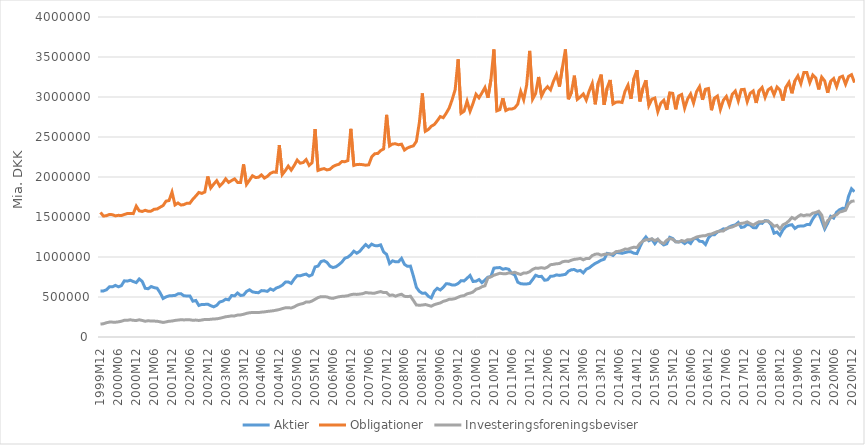
| Category | Aktier | Obligationer | Investeringsforeningsbeviser |
|---|---|---|---|
| 1999M12 | 575174 | 1557344 | 160748 |
| 2000M01 | 575647 | 1511391 | 165778 |
| 2000M02 | 590162 | 1516681 | 178351 |
| 2000M03 | 627205 | 1531792 | 186450 |
| 2000M04 | 627098 | 1528959 | 185941 |
| 2000M05 | 645738 | 1514125 | 184746 |
| 2000M06 | 627336 | 1521104 | 189451 |
| 2000M07 | 641242 | 1517881 | 196711 |
| 2000M08 | 702030 | 1531576 | 209725 |
| 2000M09 | 698497 | 1543590 | 208058 |
| 2000M10 | 709608 | 1545110 | 215514 |
| 2000M11 | 693340 | 1542126 | 208436 |
| 2000M12 | 679721 | 1635693 | 206347 |
| 2001M01 | 725587 | 1576917 | 214998 |
| 2001M02 | 694857 | 1569066 | 206745 |
| 2001M03 | 609401 | 1583968 | 196955 |
| 2001M04 | 603191 | 1572117 | 203492 |
| 2001M05 | 630929 | 1573534 | 198988 |
| 2001M06 | 617507 | 1596730 | 199211 |
| 2001M07 | 609553 | 1600137 | 196654 |
| 2001M08 | 553257 | 1622133 | 190230 |
| 2001M09 | 481246 | 1642834 | 181861 |
| 2001M10 | 501680 | 1698473 | 188909 |
| 2001M11 | 513948 | 1705760 | 196822 |
| 2001M12 | 516411 | 1811508 | 199644 |
| 2002M01 | 519822 | 1650899 | 207163 |
| 2002M02 | 539138 | 1675130 | 211558 |
| 2002M03 | 541132 | 1649367 | 216023 |
| 2002M04 | 514315 | 1654759 | 213580 |
| 2002M05 | 513817 | 1672767 | 215308 |
| 2002M06 | 513817 | 1672767 | 215308 |
| 2002M07 | 447539 | 1723382 | 208760 |
| 2002M08 | 456303 | 1762651 | 211579 |
| 2002M09 | 394395 | 1806730 | 206568 |
| 2002M10 | 406663 | 1795063 | 212548 |
| 2002M11 | 407258 | 1812469 | 219093 |
| 2002M12 | 410511 | 2006227 | 217309 |
| 2003M01 | 391549 | 1863047 | 221673 |
| 2003M02 | 376802 | 1911051 | 225702 |
| 2003M03 | 395690 | 1954134 | 227024 |
| 2003M04 | 437489 | 1886932 | 234152 |
| 2003M05 | 448094 | 1922970 | 242874 |
| 2003M06 | 472372 | 1977111 | 253018 |
| 2003M07 | 464487 | 1932479 | 257571 |
| 2003M08 | 518497 | 1955701 | 264121 |
| 2003M09 | 514394 | 1976613 | 263728 |
| 2003M10 | 549719 | 1932259 | 274176 |
| 2003M11 | 518793 | 1930731 | 276357 |
| 2003M12 | 524264 | 2157438 | 283847 |
| 2004M01 | 569517 | 1907331 | 295540 |
| 2004M02 | 590348 | 1960377 | 302996 |
| 2004M03 | 563873 | 2015258 | 306728 |
| 2004M04 | 557087 | 1994459 | 304884 |
| 2004M05 | 553644 | 1995813 | 305509 |
| 2004M06 | 579982 | 2026560 | 310671 |
| 2004M07 | 577582 | 1986508 | 314125 |
| 2004M08 | 570687 | 2008771 | 319660 |
| 2004M09 | 601262 | 2044870 | 323707 |
| 2004M10 | 584594 | 2062475 | 328383 |
| 2004M11 | 612471 | 2058625 | 335384 |
| 2004M12 | 626287 | 2399007 | 343144 |
| 2005M01 | 647568 | 2030789 | 354733 |
| 2005M02 | 686066 | 2079000 | 364640 |
| 2005M03 | 688607 | 2136473 | 366253 |
| 2005M04 | 670048 | 2086332 | 362498 |
| 2005M05 | 725046 | 2143882 | 376826 |
| 2005M06 | 767618 | 2211582 | 397766 |
| 2005M07 | 764645 | 2171839 | 410469 |
| 2005M08 | 777319 | 2181082 | 418972 |
| 2005M09 | 786332 | 2218467 | 438329 |
| 2005M10 | 761261 | 2144434 | 436105 |
| 2005M11 | 777998 | 2179472 | 450288 |
| 2005M12 | 876163 | 2599662 | 471850 |
| 2006M01 | 886363 | 2081826 | 492881 |
| 2006M02 | 943407 | 2096086 | 504632 |
| 2006M03 | 953835 | 2105200 | 502265 |
| 2006M04 | 932787 | 2088709 | 501263 |
| 2006M05 | 885160 | 2096140 | 487065 |
| 2006M06 | 868076 | 2130715 | 482889 |
| 2006M07 | 878239 | 2147943 | 493746 |
| 2006M08 | 904551 | 2159636 | 503033 |
| 2006M09 | 936797 | 2193171 | 508286 |
| 2006M10 | 984872 | 2191238 | 510813 |
| 2006M11 | 997962 | 2205316 | 516009 |
| 2006M12 | 1027930 | 2602178 | 528614 |
| 2007M01 | 1072939 | 2144428 | 535917 |
| 2007M02 | 1047612 | 2156160 | 532186 |
| 2007M03 | 1070763 | 2158080 | 536508 |
| 2007M04 | 1116896 | 2153997 | 541713 |
| 2007M05 | 1155385 | 2147554 | 555614 |
| 2007M06 | 1123217 | 2152316 | 550464 |
| 2007M07 | 1160422 | 2250769 | 548335 |
| 2007M08 | 1142552 | 2290712 | 547958 |
| 2007M09 | 1140519 | 2293926 | 558609 |
| 2007M10 | 1151802 | 2330081 | 568203 |
| 2007M11 | 1063171 | 2350492 | 555042 |
| 2007M12 | 1033177 | 2777086 | 555003 |
| 2008M01 | 918225 | 2388301 | 520054 |
| 2008M02 | 952377 | 2413171 | 526022 |
| 2008M03 | 940197 | 2415065 | 510069 |
| 2008M04 | 941535 | 2403112 | 524526 |
| 2008M05 | 982089 | 2410140 | 534425 |
| 2008M06 | 908343 | 2337160 | 508793 |
| 2008M07 | 883307 | 2362838 | 504650 |
| 2008M08 | 886096 | 2378275 | 510319 |
| 2008M09 | 759950 | 2389665 | 456584 |
| 2008M10 | 620008 | 2445823 | 399629 |
| 2008M11 | 570116 | 2683893 | 397576 |
| 2008M12 | 545871 | 3044262 | 398958 |
| 2009M01 | 549715 | 2571659 | 405919 |
| 2009M02 | 509245 | 2593509 | 395518 |
| 2009M03 | 488425 | 2634439 | 384809 |
| 2009M04 | 571307 | 2655599 | 403575 |
| 2009M05 | 608507 | 2702649 | 415678 |
| 2009M06 | 587808 | 2755471 | 425281 |
| 2009M07 | 620395 | 2741454 | 445444 |
| 2009M08 | 666249 | 2797081 | 455808 |
| 2009M09 | 662900 | 2862025 | 471255 |
| 2009M10 | 649205 | 2967408 | 473076 |
| 2009M11 | 650795 | 3091417 | 480443 |
| 2009M12 | 668987 | 3470399 | 497313 |
| 2010M01 | 704145 | 2797013 | 511840 |
| 2010M02 | 700775 | 2822479 | 517108 |
| 2010M03 | 734573 | 2947573 | 539561 |
| 2010M04 | 768999 | 2821624 | 548623 |
| 2010M05 | 693852 | 2919512 | 561939 |
| 2010M06 | 697532 | 3034452 | 597185 |
| 2010M07 | 717785 | 2989715 | 607574 |
| 2010M08 | 679719 | 3052346 | 628490 |
| 2010M09 | 711815 | 3118357 | 640203 |
| 2010M10 | 748166 | 2990379 | 739615 |
| 2010M11 | 755357 | 3214863 | 752164 |
| 2010M12 | 860927 | 3594134 | 771586 |
| 2011M01 | 865634 | 2827974 | 784306 |
| 2011M02 | 868103 | 2842919 | 796417 |
| 2011M03 | 846852 | 2985437 | 791657 |
| 2011M04 | 855641 | 2831028 | 790599 |
| 2011M05 | 846467 | 2849098 | 800536 |
| 2011M06 | 793880 | 2848803 | 799381 |
| 2011M07 | 776121 | 2864109 | 808539 |
| 2011M08 | 685664 | 2911356 | 793058 |
| 2011M09 | 666474 | 3069425 | 781106 |
| 2011M10 | 662567 | 2965332 | 800475 |
| 2011M11 | 663050 | 3152146 | 801234 |
| 2011M12 | 669523 | 3576010 | 816113 |
| 2012M01 | 718139 | 2973050 | 845524 |
| 2012M02 | 771891 | 3043339 | 861101 |
| 2012M03 | 756309 | 3250779 | 860080 |
| 2012M04 | 758267 | 3012721 | 866469 |
| 2012M05 | 709421 | 3086802 | 858201 |
| 2012M06 | 715047 | 3129053 | 874065 |
| 2012M07 | 759130 | 3089635 | 903626 |
| 2012M08 | 761567 | 3196643 | 908313 |
| 2012M09 | 776340 | 3280142 | 915947 |
| 2012M10 | 769931 | 3130351 | 918047 |
| 2012M11 | 776180 | 3372924 | 939726 |
| 2012M12 | 783027 | 3594865 | 948097 |
| 2013M01 | 822643 | 2971794 | 944493 |
| 2013M02 | 840966 | 3055002 | 959815 |
| 2013M03 | 843061 | 3266687 | 970768 |
| 2013M04 | 823083 | 2970608 | 974951 |
| 2013M05 | 832404 | 3000721 | 982733 |
| 2013M06 | 801438 | 3037018 | 964751 |
| 2013M07 | 847509 | 2961347 | 981962 |
| 2013M08 | 864162 | 3076403 | 981785 |
| 2013M09 | 894095 | 3168318 | 1017385 |
| 2013M10 | 919727 | 2908692 | 1035193 |
| 2013M11 | 938002 | 3173965 | 1038076 |
| 2013M12 | 960100 | 3280446 | 1022521 |
| 2014M01 | 972051 | 2901676 | 1033038 |
| 2014M02 | 1045250 | 3113336 | 1038806 |
| 2014M03 | 1036700 | 3212970 | 1035572 |
| 2014M04 | 1019324 | 2913924 | 1040537 |
| 2014M05 | 1056345 | 2935294 | 1067899 |
| 2014M06 | 1053268 | 2939289 | 1071309 |
| 2014M07 | 1045577 | 2931923 | 1082399 |
| 2014M08 | 1055727 | 3072485 | 1099020 |
| 2014M09 | 1064387 | 3147346 | 1097512 |
| 2014M10 | 1065062 | 2976149 | 1112138 |
| 2014M11 | 1047105 | 3233681 | 1122770 |
| 2014M12 | 1042846 | 3335104 | 1117579 |
| 2015M01 | 1127106 | 2944162 | 1168416 |
| 2015M02 | 1204008 | 3110563 | 1198616 |
| 2015M03 | 1250650 | 3209223 | 1214989 |
| 2015M04 | 1203383 | 2893858 | 1217483 |
| 2015M05 | 1222973 | 2972672 | 1227671 |
| 2015M06 | 1167167 | 2987107 | 1204045 |
| 2015M07 | 1217273 | 2816092 | 1222869 |
| 2015M08 | 1180886 | 2920478 | 1183209 |
| 2015M09 | 1150968 | 2959819 | 1168840 |
| 2015M10 | 1164772 | 2840932 | 1209796 |
| 2015M11 | 1246261 | 3051786 | 1230392 |
| 2015M12 | 1231384 | 3045899 | 1221305 |
| 2016M01 | 1189395 | 2845990 | 1190360 |
| 2016M02 | 1188901 | 3013158 | 1186317 |
| 2016M03 | 1194812 | 3031239 | 1206339 |
| 2016M04 | 1167867 | 2860692 | 1194605 |
| 2016M05 | 1195364 | 2975857 | 1216550 |
| 2016M06 | 1169180 | 3037508 | 1214723 |
| 2016M07 | 1226644 | 2924713 | 1230825 |
| 2016M08 | 1232244 | 3066071 | 1249459 |
| 2016M09 | 1196029 | 3129698 | 1257885 |
| 2016M10 | 1194275 | 2965309 | 1264519 |
| 2016M11 | 1155665 | 3096966 | 1266793 |
| 2016M12 | 1238726 | 3106073 | 1282391 |
| 2017M01 | 1278458 | 2834637 | 1286855 |
| 2017M02 | 1276900 | 2985265 | 1303039 |
| 2017M03 | 1312374 | 3011967 | 1317878 |
| 2017M04 | 1329143 | 2844019 | 1325039 |
| 2017M05 | 1351844 | 2960135 | 1324912 |
| 2017M06 | 1349249 | 3006472 | 1355345 |
| 2017M07 | 1375716 | 2899525 | 1366734 |
| 2017M08 | 1392160 | 3034719 | 1375628 |
| 2017M09 | 1400591 | 3074375 | 1392275 |
| 2017M10 | 1431720 | 2950935 | 1410574 |
| 2017M11 | 1369476 | 3092092 | 1420188 |
| 2017M12 | 1376869 | 3095680 | 1425073 |
| 2018M01 | 1407538 | 2941743 | 1438999 |
| 2018M02 | 1399905 | 3047262 | 1418267 |
| 2018M03 | 1367243 | 3075427 | 1399756 |
| 2018M04 | 1365830 | 2925642 | 1421287 |
| 2018M05 | 1425125 | 3078944 | 1441832 |
| 2018M06 | 1420308 | 3118913 | 1440304 |
| 2018M07 | 1454433 | 2995199 | 1451031 |
| 2018M08 | 1449524 | 3089395 | 1447722 |
| 2018M09 | 1404515 | 3116133 | 1421408 |
| 2018M10 | 1297714 | 3026923 | 1383594 |
| 2018M11 | 1311551 | 3124069 | 1395311 |
| 2018M12 | 1271057 | 3085873 | 1348836 |
| 2019M01 | 1340054 | 2954765 | 1403054 |
| 2019M02 | 1381161 | 3123581 | 1420342 |
| 2019M03 | 1396480 | 3183389 | 1452022 |
| 2019M04 | 1404114 | 3046478 | 1493746 |
| 2019M05 | 1357177 | 3202146 | 1474309 |
| 2019M06 | 1382926 | 3264038 | 1505131 |
| 2019M07 | 1388085 | 3167679 | 1528369 |
| 2019M08 | 1388312 | 3306352 | 1515198 |
| 2019M09 | 1405118 | 3306503 | 1527154 |
| 2019M10 | 1404621 | 3179432 | 1522136 |
| 2019M11 | 1475397 | 3275056 | 1548192 |
| 2019M12 | 1529311 | 3237361 | 1555824 |
| 2020M01 | 1552952 | 3094650 | 1572243 |
| 2020M02 | 1450837 | 3248504 | 1523280 |
| 2020M03 | 1350989 | 3200760 | 1381392 |
| 2020M04 | 1422433 | 3052446 | 1454341 |
| 2020M05 | 1508388 | 3195389 | 1489625 |
| 2020M06 | 1486491 | 3230888 | 1516321 |
| 2020M07 | 1560349 | 3129159 | 1528232 |
| 2020M08 | 1591479 | 3244098 | 1561570 |
| 2020M09 | 1609396 | 3260037 | 1571358 |
| 2020M10 | 1605141 | 3159704 | 1584078 |
| 2020M11 | 1758577 | 3257527 | 1665174 |
| 2020M12 | 1852988 | 3279137 | 1695419 |
| 2021M01 | 1816590 | 3180012 | 1701485 |